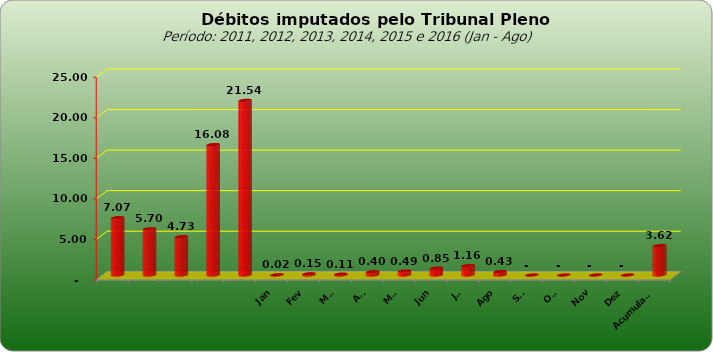
| Category |  7.073.154,74  |
|---|---|
|  | 7073154.74 |
|  | 5698720.25 |
|  | 4727033.51 |
|  | 16081820.48 |
|  | 21535723.6 |
| Jan | 22059.63 |
| Fev | 154318.14 |
| Mar | 112460.95 |
| Abr | 404403.01 |
| Mai | 486409.52 |
| Jun | 852405.84 |
| Jul | 1163444.79 |
| Ago | 426141.81 |
| Set | 0 |
| Out | 0 |
| Nov | 0 |
| Dez | 0 |
| Acumulado | 3621643.69 |